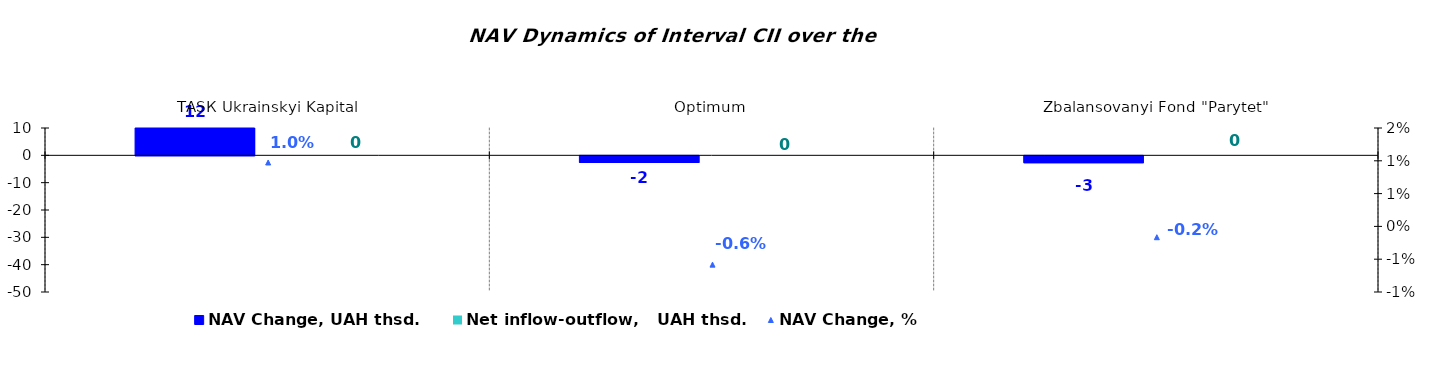
| Category | NAV Change, UAH thsd. | Net inflow-outflow,   UAH thsd. |
|---|---|---|
| ТАSК Ukrainskyi Kapital | 12.318 | 0 |
| Оptimum | -2.431 | 0 |
| Zbalansovanyi Fond "Parytet" | -2.535 | 0 |